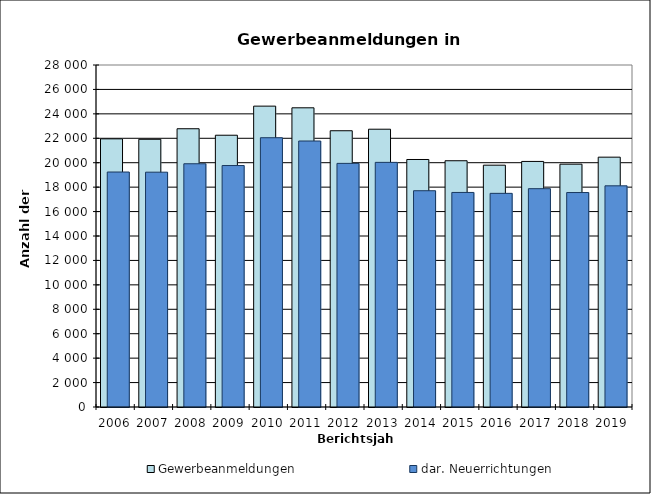
| Category | Gewerbeanmeldungen | dar. Neuerrichtungen |
|---|---|---|
| 2006.0 | 21955 | 19238 |
| 2007.0 | 21918 | 19225 |
| 2008.0 | 22781 | 19914 |
| 2009.0 | 22250 | 19769 |
| 2010.0 | 24632 | 22046 |
| 2011.0 | 24495 | 21777 |
| 2012.0 | 22618 | 19945 |
| 2013.0 | 22743 | 20029 |
| 2014.0 | 20264 | 17706 |
| 2015.0 | 20162 | 17566 |
| 2016.0 | 19798 | 17492 |
| 2017.0 | 20105 | 17874 |
| 2018.0 | 19880 | 17558 |
| 2019.0 | 20454 | 18108 |